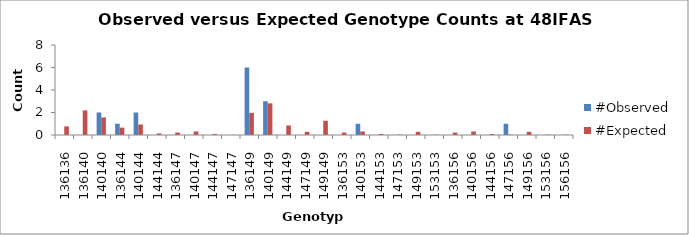
| Category | #Observed | #Expected |
|---|---|---|
| 136136.0 | 0 | 0.766 |
| 136140.0 | 0 | 2.188 |
| 140140.0 | 2 | 1.562 |
| 136144.0 | 1 | 0.656 |
| 140144.0 | 2 | 0.938 |
| 144144.0 | 0 | 0.141 |
| 136147.0 | 0 | 0.219 |
| 140147.0 | 0 | 0.312 |
| 144147.0 | 0 | 0.094 |
| 147147.0 | 0 | 0.016 |
| 136149.0 | 6 | 1.969 |
| 140149.0 | 3 | 2.812 |
| 144149.0 | 0 | 0.844 |
| 147149.0 | 0 | 0.281 |
| 149149.0 | 0 | 1.266 |
| 136153.0 | 0 | 0.219 |
| 140153.0 | 1 | 0.312 |
| 144153.0 | 0 | 0.094 |
| 147153.0 | 0 | 0.031 |
| 149153.0 | 0 | 0.281 |
| 153153.0 | 0 | 0.016 |
| 136156.0 | 0 | 0.219 |
| 140156.0 | 0 | 0.312 |
| 144156.0 | 0 | 0.094 |
| 147156.0 | 1 | 0.031 |
| 149156.0 | 0 | 0.281 |
| 153156.0 | 0 | 0.031 |
| 156156.0 | 0 | 0.016 |